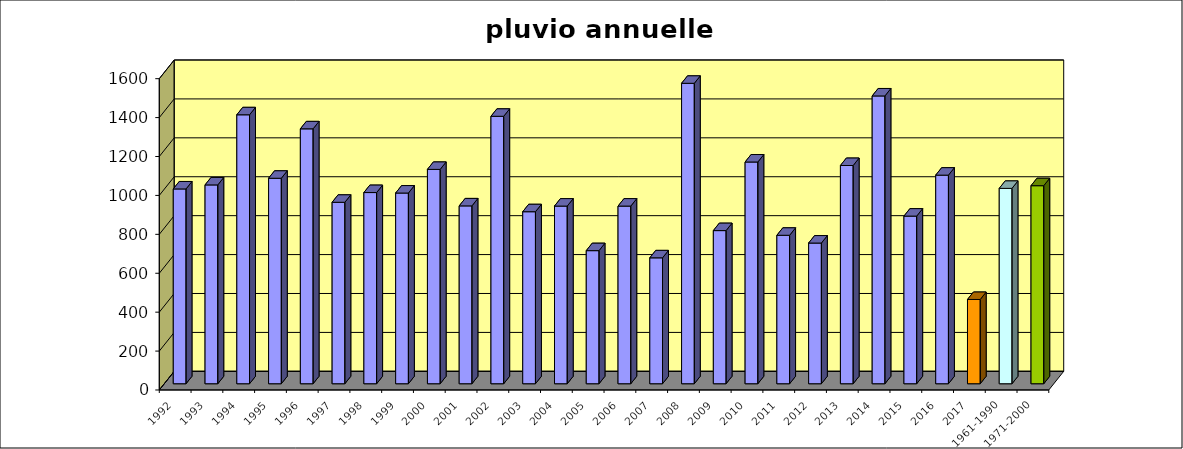
| Category | 1992 1993 1994 1995 1996 1997 1998 1999 2000 2001 2002 2003 2004 2005 2006 2007 2008 2009 2010 2011 2012 2013 2014 2015 2016 2017 1961-1990 1971-2000 |
|---|---|
| 1992 | 1001.1 |
| 1993 | 1021.8 |
| 1994 | 1382.2 |
| 1995 | 1056 |
| 1996 | 1310 |
| 1997 | 932.5 |
| 1998 | 982.5 |
| 1999 | 980 |
| 2000 | 1101.5 |
| 2001 | 914 |
| 2002 | 1374.5 |
| 2003 | 884 |
| 2004 | 913 |
| 2005 | 684 |
| 2006 | 913 |
| 2007 | 647 |
| 2008 | 1544 |
| 2009 | 787 |
| 2010 | 1139.5 |
| 2011 | 763 |
| 2012 | 723 |
| 2013 | 1121.5 |
| 2014 | 1479 |
| 2015 | 861.5 |
| 2016 | 1072 |
| 2017 | 433 |
| 1961-1990 | 1004 |
| 1971-2000 | 1017.8 |